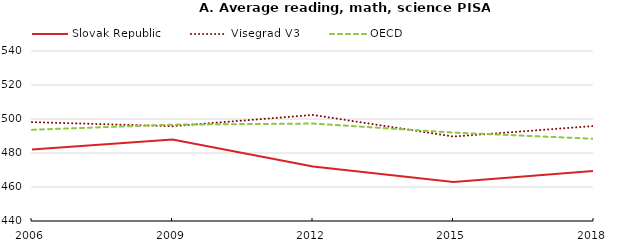
| Category | Slovak Republic | Visegrad V3 | OECD |
|---|---|---|---|
| 2006.0 | 482 | 498.173 | 493.667 |
| 2009.0 | 488 | 495.76 | 496.667 |
| 2012.0 | 472 | 502.384 | 497.333 |
| 2015.0 | 463 | 489.679 | 492 |
| 2018.0 | 469.399 | 495.889 | 488.358 |